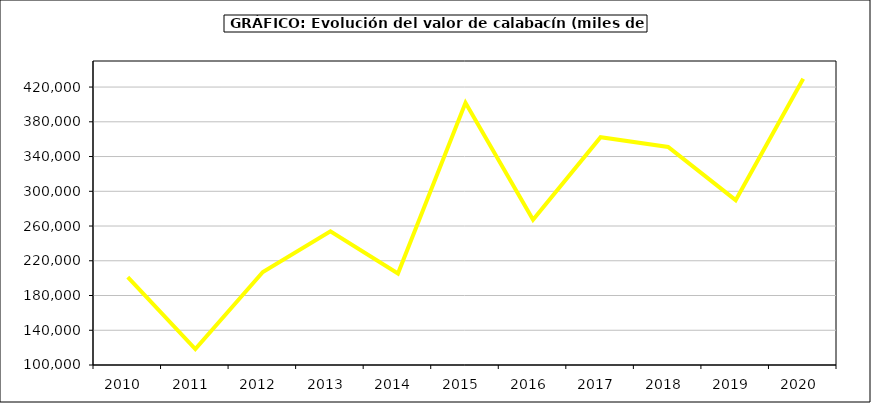
| Category | Valor |
|---|---|
| 2010.0 | 201170.752 |
| 2011.0 | 118311.354 |
| 2012.0 | 207035.363 |
| 2013.0 | 253994.073 |
| 2014.0 | 205307.232 |
| 2015.0 | 401801.34 |
| 2016.0 | 267259 |
| 2017.0 | 362286.358 |
| 2018.0 | 351050.64 |
| 2019.0 | 289805.222 |
| 2020.0 | 429498.418 |